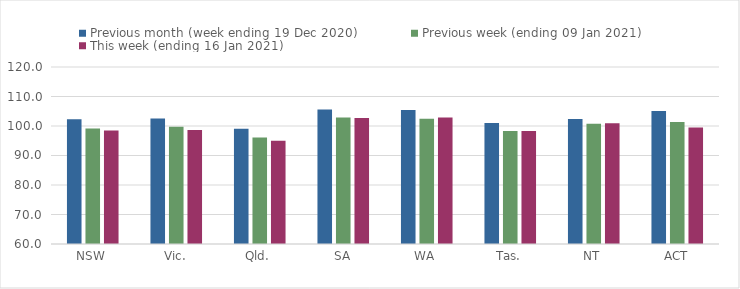
| Category | Previous month (week ending 19 Dec 2020) | Previous week (ending 09 Jan 2021) | This week (ending 16 Jan 2021) |
|---|---|---|---|
| NSW | 102.27 | 99.14 | 98.44 |
| Vic. | 102.57 | 99.71 | 98.65 |
| Qld. | 99.05 | 96.14 | 94.98 |
| SA | 105.56 | 102.92 | 102.75 |
| WA | 105.42 | 102.44 | 102.9 |
| Tas. | 101 | 98.34 | 98.34 |
| NT | 102.34 | 100.75 | 100.89 |
| ACT | 105.07 | 101.36 | 99.49 |